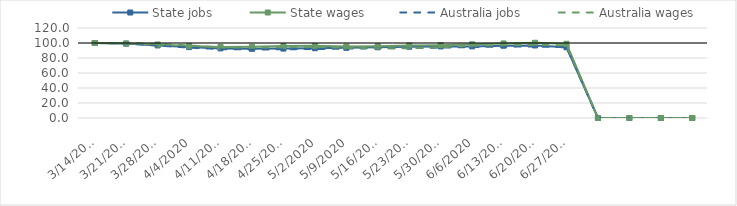
| Category | State jobs | State wages | Australia jobs | Australia wages |
|---|---|---|---|---|
| 14/03/2020 | 100 | 100 | 100 | 100 |
| 21/03/2020 | 99.194 | 99.314 | 99.389 | 100.07 |
| 28/03/2020 | 96.753 | 98.04 | 96.608 | 98.707 |
| 04/04/2020 | 94.506 | 96.084 | 93.828 | 96.765 |
| 11/04/2020 | 92.822 | 94.83 | 91.887 | 94.047 |
| 18/04/2020 | 92.235 | 94.928 | 91.31 | 93.932 |
| 25/04/2020 | 92.549 | 95.93 | 91.6 | 94.326 |
| 02/05/2020 | 93.01 | 96.22 | 91.954 | 94.889 |
| 09/05/2020 | 93.542 | 95.275 | 92.449 | 93.491 |
| 16/05/2020 | 94.326 | 95.735 | 92.97 | 93.144 |
| 23/05/2020 | 95.013 | 96.696 | 93.251 | 92.924 |
| 30/05/2020 | 95.41 | 97.045 | 93.813 | 94.361 |
| 06/06/2020 | 95.489 | 98.237 | 94.668 | 96.401 |
| 13/06/2020 | 96.363 | 99.455 | 95.11 | 97.158 |
| 20/06/2020 | 96.716 | 100.299 | 95.246 | 97.537 |
| 27/06/2020 | 94.272 | 98.945 | 94.328 | 96.826 |